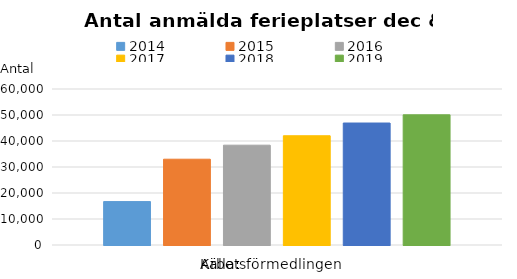
| Category | 2014 | 2015 | 2016 | 2017 | 2018 | 2019 |
|---|---|---|---|---|---|---|
| 0 | 16698 | 32996 | 38390 | 42019 | 46913 | 50075 |